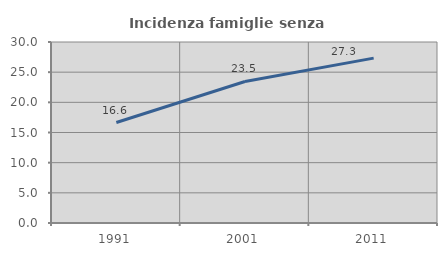
| Category | Incidenza famiglie senza nuclei |
|---|---|
| 1991.0 | 16.65 |
| 2001.0 | 23.455 |
| 2011.0 | 27.33 |